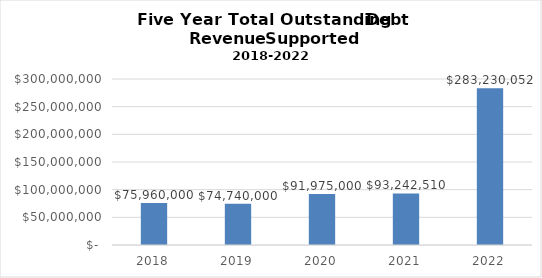
| Category | Series 0 |
|---|---|
| 2018.0 | 75960000 |
| 2019.0 | 74740000 |
| 2020.0 | 91975000 |
| 2021.0 | 93242510 |
| 2022.0 | 283230052 |